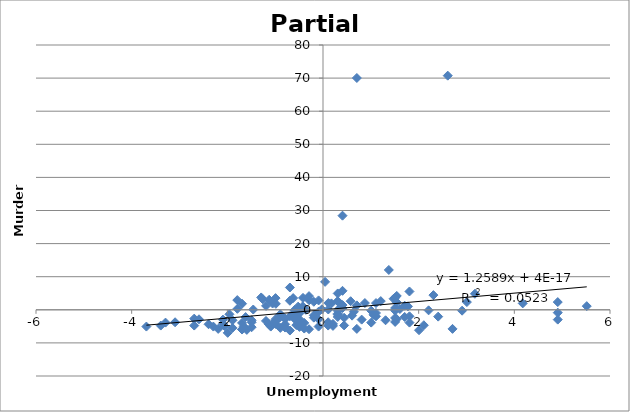
| Category | Series 0 |
|---|---|
| 1.7759207188666588 | 1.038 |
| 0.5780191083564645 | 2.594 |
| 1.475920718866659 | 3.338 |
| 4.907855125873456 | 2.334 |
| 1.0078551258734558 | -0.266 |
| 1.7078551258734551 | 1.234 |
| 0.30785512587345565 | -0.266 |
| -0.5921448741265447 | -0.066 |
| 0.10995351536326137 | 0.09 |
| 2.207855125873455 | -0.166 |
| 0.8759207188666593 | 2.038 |
| 0.17592071886665916 | 1.938 |
| -0.0921448741265447 | 2.834 |
| -0.2921448741265449 | 4.134 |
| 3.1759207188666583 | 4.838 |
| 1.8078551258734556 | -1.966 |
| -0.9921448741265442 | -3.566 |
| -0.6921448741265444 | -1.966 |
| -2.5921448741265447 | -2.866 |
| -0.7921448741265449 | -2.666 |
| 0.30785512587345565 | -1.466 |
| -2.6921448741265444 | -2.666 |
| -0.7921448741265449 | -2.766 |
| -0.5921448741265447 | -2.766 |
| 0.4078551258734553 | 28.434 |
| 0.7078551258734551 | 70.034 |
| 2.6078551258734555 | 70.734 |
| -1.053915298650331 | 1.898 |
| -0.5198825021537292 | 0.95 |
| 0.6460847013496691 | -0.602 |
| -0.9858497056571274 | 1.802 |
| -0.6240792811333407 | 3.538 |
| -0.290046484636739 | 2.89 |
| -2.0921448741265447 | -2.966 |
| -3.0921448741265447 | -3.766 |
| -1.6921448741265444 | -3.966 |
| 2.1078551258734555 | -4.666 |
| -0.0921448741265447 | -5.066 |
| 0.20785512587345512 | -4.866 |
| 1.5078551258734558 | 0.534 |
| 0.30785512587345565 | 2.534 |
| 1.5078551258734558 | 3.634 |
| 0.44188792237005803 | -2.414 |
| -0.5921448741265447 | -1.566 |
| -0.5921448741265447 | -0.266 |
| -0.39214487412654453 | -5.666 |
| -1.6921448741265444 | -5.866 |
| -1.8921448741265445 | -5.466 |
| -0.9921448741265442 | -3.366 |
| -1.4921448741265442 | -3.766 |
| -0.8921448741265445 | -1.366 |
| 2.907855125873456 | -0.266 |
| -0.0921448741265447 | -0.566 |
| 0.30785512587345565 | -1.166 |
| 5.514150294342873 | 1.102 |
| 0.04398631185986357 | 8.442 |
| 1.3759207188666593 | 12.038 |
| -1.4921448741265442 | -5.266 |
| -0.7921448741265449 | -5.366 |
| 2.007855125873456 | -6.166 |
| -1.6921448741265444 | 1.834 |
| -1.2921448741265449 | 3.734 |
| 0.30785512587345565 | 4.934 |
| -2.6921448741265444 | -4.766 |
| 0.10785512587345547 | -3.766 |
| 1.0078551258734558 | -3.866 |
| 2.3078551258734548 | 4.434 |
| 1.2078551258734551 | 2.634 |
| 1.1078551258734555 | 2.034 |
| -0.4921448741265442 | -5.166 |
| -1.0921448741265447 | -5.066 |
| -0.7921448741265449 | -4.366 |
| 4.175920718866658 | 1.938 |
| 1.5418879223700577 | 4.186 |
| 0.4078551258734553 | 5.734 |
| 0.4078551258734553 | 0.534 |
| -0.5219808916435351 | -0.206 |
| 0.11205190485306726 | 2.046 |
| 1.5078551258734558 | -3.666 |
| -0.0921448741265447 | -2.866 |
| 0.10785512587345547 | -4.766 |
| -0.9921448741265442 | -4.266 |
| -3.6921448741265444 | -5.066 |
| -3.2921448741265444 | -3.866 |
| 0.3418879223700575 | 0.386 |
| -1.1900464846367385 | 1.19 |
| 0.30785512587345565 | 2.634 |
| -3.3921448741265445 | -4.766 |
| -0.2921448741265449 | -5.866 |
| 0.7078551258734551 | -5.766 |
| -1.8921448741265445 | -3.166 |
| -0.8921448741265445 | -2.166 |
| 1.5078551258734558 | -2.466 |
| 3.007855125873456 | 2.334 |
| 0.4078551258734553 | 1.434 |
| 1.6078551258734555 | 0.234 |
| -0.9921448741265442 | 3.534 |
| -0.6921448741265444 | 6.734 |
| 1.8078551258734556 | 5.534 |
| -1.4581120776299423 | 0.086 |
| -1.7921448741265449 | 2.934 |
| -1.1240792811333407 | 3.038 |
| -0.6921448741265444 | -6.266 |
| -1.9921448741265446 | -6.966 |
| -1.5921448741265447 | -6.066 |
| 1.1078551258734555 | -1.966 |
| -0.19214487412654435 | -1.666 |
| 0.6078551258734555 | -1.766 |
| 1.5078551258734558 | -0.266 |
| -0.3581120776299427 | -0.014 |
| -0.024079281133341013 | 0.138 |
| 0.30785512587345565 | -2.166 |
| -0.39214487412654453 | -3.966 |
| 1.3078551258734556 | -3.166 |
| -0.19214487412654435 | -2.366 |
| -0.4921448741265442 | -1.066 |
| 1.1078551258734555 | -0.966 |
| -2.0921448741265447 | -4.266 |
| 0.8078551258734556 | -2.966 |
| 1.8078551258734556 | -3.866 |
| -0.42407928113334137 | 1.038 |
| -1.2581120776299421 | 3.186 |
| 1.5418879223700577 | 2.286 |
| -1.6921448741265444 | -5.966 |
| -2.1921448741265444 | -5.766 |
| -2.3921448741265445 | -4.366 |
| 0.7078551258734551 | 1.334 |
| -0.6921448741265444 | 2.734 |
| -0.19214487412654435 | 2.434 |
| 1.056576648798698 | -1.523 |
| -0.4177841126639237 | 3.605 |
| -1.1350297932420794 | -4.3 |
| 0.44188792237005803 | -4.714 |
| -1.6581120776299425 | -5.014 |
| -2.0581120776299424 | -4.914 |
| -2.2921448741265444 | -5.066 |
| -0.8921448741265445 | -5.466 |
| -0.4921448741265442 | -4.166 |
| -1.9560136881401364 | -1.358 |
| -1.790046484636739 | 0.29 |
| -1.6177841126639239 | -2.195 |
| 1.7078551258734551 | -2.166 |
| -0.9921448741265442 | -2.866 |
| 1.5418879223700577 | -2.814 |
| 4.907855125873456 | -2.966 |
| 2.407855125873456 | -2.066 |
| 4.907855125873456 | -0.866 |
| 0.20785512587345512 | -4.266 |
| -1.4921448741265442 | -3.166 |
| -1.1921448741265444 | -3.366 |
| 2.707855125873455 | -5.766 |
| -0.4921448741265442 | -2.866 |
| -0.558112077629942 | -4.614 |